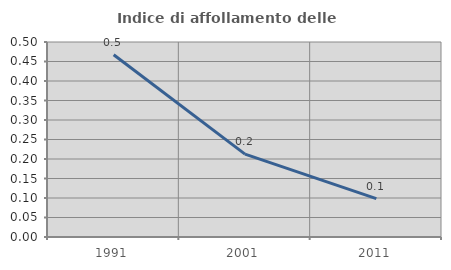
| Category | Indice di affollamento delle abitazioni  |
|---|---|
| 1991.0 | 0.467 |
| 2001.0 | 0.213 |
| 2011.0 | 0.098 |